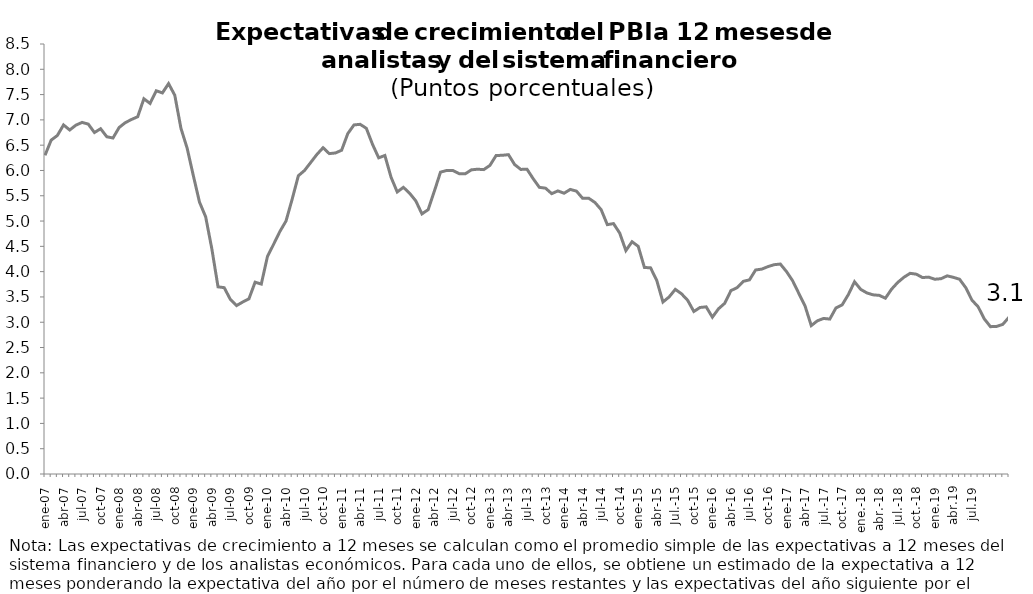
| Category | Series 7 |
|---|---|
| ene.-07 | 6.3 |
| feb.-07 | 6.6 |
| mar.-07 | 6.692 |
| abr.-07 | 6.9 |
| may.-07 | 6.8 |
| jun.-07 | 6.896 |
| jul.-07 | 6.95 |
| ago.-07 | 6.917 |
| sep.-07 | 6.75 |
| oct.-07 | 6.825 |
| nov.-07 | 6.667 |
| dic.-07 | 6.642 |
| ene.-08 | 6.85 |
| feb.-08 | 6.946 |
| mar.-08 | 7.008 |
| abr.-08 | 7.063 |
| may.-08 | 7.417 |
| jun.-08 | 7.325 |
| jul.-08 | 7.575 |
| ago.-08 | 7.533 |
| sep.-08 | 7.717 |
| oct.-08 | 7.488 |
| nov.-08 | 6.833 |
| dic.-08 | 6.442 |
| ene.-09 | 5.9 |
| feb.-09 | 5.375 |
| mar.-09 | 5.083 |
| abr.-09 | 4.45 |
| may.-09 | 3.7 |
| jun.-09 | 3.683 |
| jul.-09 | 3.45 |
| ago.-09 | 3.329 |
| sep.-09 | 3.4 |
| oct.-09 | 3.462 |
| nov.-09 | 3.792 |
| dic.-09 | 3.754 |
| ene.-10 | 4.3 |
| feb.-10 | 4.542 |
| mar.-10 | 4.792 |
| abr.-10 | 5 |
| may.-10 | 5.433 |
| jun.-10 | 5.896 |
| jul.-10 | 6 |
| ago.-10 | 6.158 |
| sep.-10 | 6.317 |
| oct.-10 | 6.45 |
| nov.-10 | 6.333 |
| dic.-10 | 6.346 |
| ene.-11 | 6.4 |
| feb.-11 | 6.729 |
| mar.-11 | 6.9 |
| abr.-11 | 6.913 |
| may.-11 | 6.833 |
| jun.-11 | 6.517 |
| jul.-11 | 6.25 |
| ago.-11 | 6.296 |
| sep.-11 | 5.867 |
| oct.-11 | 5.575 |
| nov.-11 | 5.667 |
| dic.-11 | 5.55 |
| ene.-12 | 5.4 |
| feb.-12 | 5.142 |
| mar.-12 | 5.225 |
| abr.-12 | 5.588 |
| may.-12 | 5.967 |
| jun.-12 | 6 |
| jul.-12 | 6 |
| ago.-12 | 5.938 |
| sep.-12 | 5.933 |
| oct.-12 | 6.012 |
| nov.-12 | 6.025 |
| dic.-12 | 6.017 |
| ene.-13 | 6.1 |
| feb.-13 | 6.296 |
| mar.-13 | 6.3 |
| abr.-13 | 6.312 |
| may.-13 | 6.117 |
| jun.-13 | 6.021 |
| jul.-13 | 6.025 |
| ago.-13 | 5.838 |
| sep.-13 | 5.667 |
| oct.-13 | 5.65 |
| nov.-13 | 5.542 |
| dic.-13 | 5.596 |
| ene.-14 | 5.55 |
| feb.-14 | 5.625 |
| mar.-14 | 5.592 |
| abr.-14 | 5.45 |
| may.-14 | 5.45 |
| jun.-14 | 5.367 |
| jul.-14 | 5.225 |
| ago.-14 | 4.929 |
| sep.-14 | 4.95 |
| oct.-14 | 4.762 |
| nov.-14 | 4.417 |
| dic.-14 | 4.592 |
| ene.-15 | 4.5 |
| feb.-15 | 4.083 |
| mar.-15 | 4.075 |
| abr.-15 | 3.825 |
| may.-15 | 3.4 |
| jun.-15 | 3.5 |
| Jul.-15 | 3.65 |
| ago.-15 | 3.563 |
| sep.-15 | 3.433 |
| oct.-15 | 3.213 |
| nov.-15 | 3.292 |
| dic.-15 | 3.304 |
| ene.-16 | 3.1 |
| feb.-16 | 3.267 |
| mar.-16 | 3.375 |
| abr.-16 | 3.625 |
| may.-16 | 3.683 |
| jun.-16 | 3.808 |
| jul.-16 | 3.838 |
| ago.-16 | 4.033 |
| sep.-16 | 4.05 |
| oct.-16 | 4.1 |
| nov.-16 | 4.138 |
| dic.-16 | 4.15 |
| ene.-17 | 4 |
| feb.-17 | 3.817 |
| mar.-17 | 3.567 |
| abr.-17 | 3.319 |
| may.-17 | 2.933 |
| jun.-17 | 3.029 |
| jul.-17 | 3.075 |
| ago.-17 | 3.063 |
| set.-17 | 3.283 |
| oct.-17 | 3.344 |
| nov.-17 | 3.546 |
| dic.-17 | 3.8 |
| ene.-18 | 3.65 |
| feb.-18 | 3.579 |
| mar.-18 | 3.542 |
| abr.-18 | 3.531 |
| may.-18 | 3.475 |
| jun.-18 | 3.654 |
| jul.-18 | 3.788 |
| ago.-18 | 3.89 |
| set.-18 | 3.967 |
| oct.-18 | 3.95 |
| nov.18 | 3.883 |
| dic.18 | 3.892 |
| ene.19 | 3.85 |
| feb.19 | 3.86 |
| mar.19 | 3.917 |
| abr.19 | 3.888 |
| may.19 | 3.85 |
| jun.19 | 3.683 |
| jul.19 | 3.438 |
| ago.19 | 3.306 |
| set.19 | 3.067 |